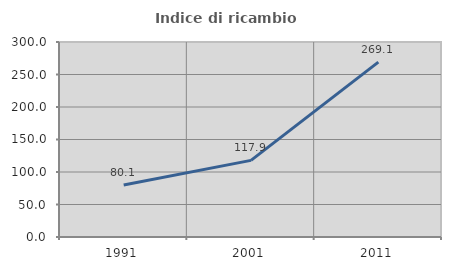
| Category | Indice di ricambio occupazionale  |
|---|---|
| 1991.0 | 80.134 |
| 2001.0 | 117.852 |
| 2011.0 | 269.058 |